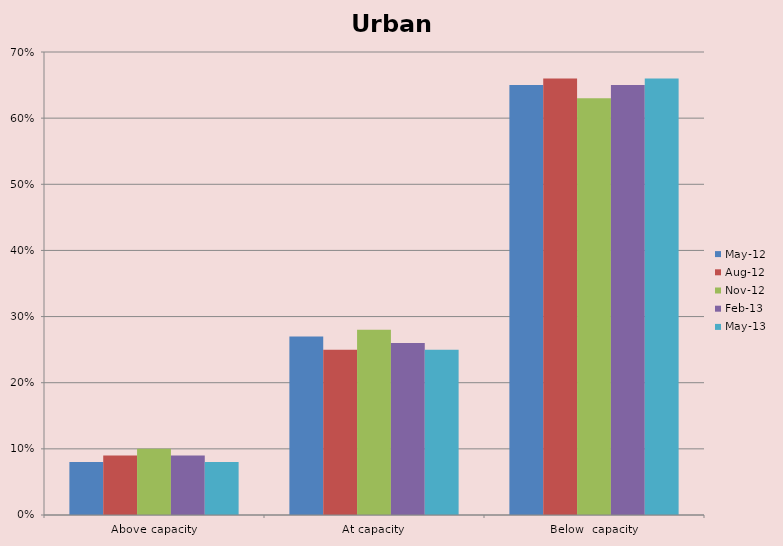
| Category | May-12 | Aug-12 | Nov-12 | Feb-13 | May-13 |
|---|---|---|---|---|---|
| Above capacity | 0.08 | 0.09 | 0.1 | 0.09 | 0.08 |
| At capacity | 0.27 | 0.25 | 0.28 | 0.26 | 0.25 |
| Below  capacity | 0.65 | 0.66 | 0.63 | 0.65 | 0.66 |